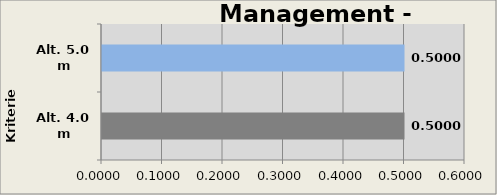
| Category | Management - A |
|---|---|
| Alt. 4.0 m | 0.5 |
| Alt. 5.0 m | 0.5 |